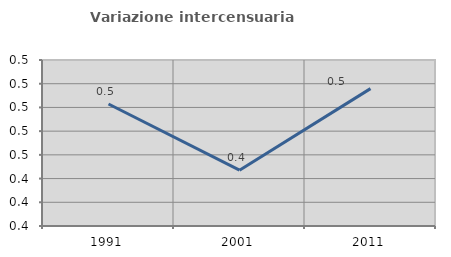
| Category | Variazione intercensuaria annua |
|---|---|
| 1991.0 | 0.503 |
| 2001.0 | 0.447 |
| 2011.0 | 0.516 |